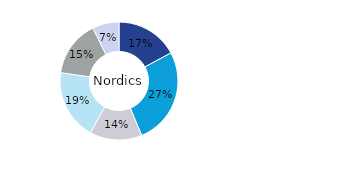
| Category | Nordics |
|---|---|
| Office | 0.171 |
| Residential | 0.266 |
| Retail | 0.143 |
| Logistics* | 0.192 |
| Public Sector** | 0.154 |
| Other | 0.073 |